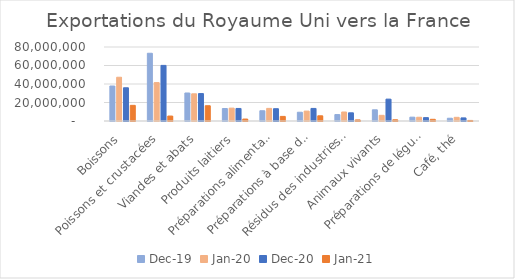
| Category | déc-19 | janv-20 | déc-20 | janv-21 |
|---|---|---|---|---|
| Boissons | 37821857 | 47311427 | 35913348 | 16919220 |
| Poissons et crustacées | 73227051 | 41526513 | 60102689 | 5346404 |
| Viandes et abats | 30280928 | 29403911 | 29659949 | 16508116 |
| Produits laitiers | 13499623 | 13906335 | 13554070 | 2103191 |
| Préparations alimentaires | 11094143 | 13645210 | 13285377 | 4977271 |
| Préparations à base de céréales | 9473087 | 10695129 | 13597246 | 5622461 |
| Résidus des industries alimentaires | 6943002 | 9736734 | 8839488 | 1169170 |
| Animaux vivants | 12107897 | 6120942 | 23637775 | 1320819 |
| Préparations de légumes ou de fruits | 4145011 | 4037614 | 3648432 | 1838367 |
| Café, thé | 2985224 | 3965225 | 3345617 | 596368 |